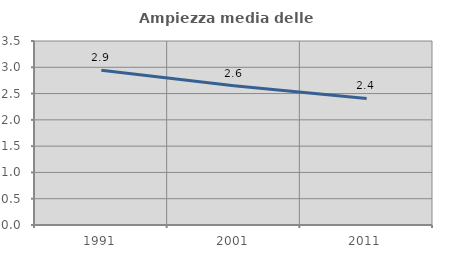
| Category | Ampiezza media delle famiglie |
|---|---|
| 1991.0 | 2.944 |
| 2001.0 | 2.647 |
| 2011.0 | 2.408 |